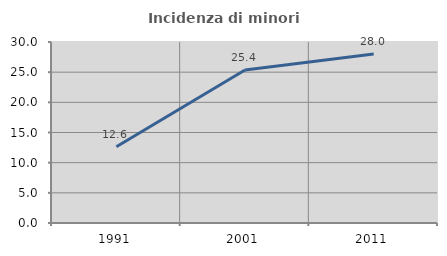
| Category | Incidenza di minori stranieri |
|---|---|
| 1991.0 | 12.644 |
| 2001.0 | 25.355 |
| 2011.0 | 28.017 |